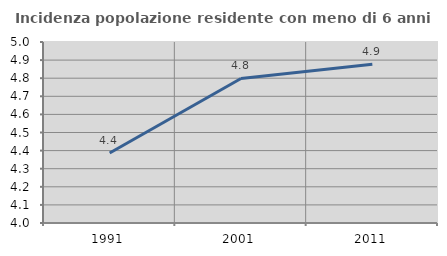
| Category | Incidenza popolazione residente con meno di 6 anni |
|---|---|
| 1991.0 | 4.387 |
| 2001.0 | 4.798 |
| 2011.0 | 4.877 |